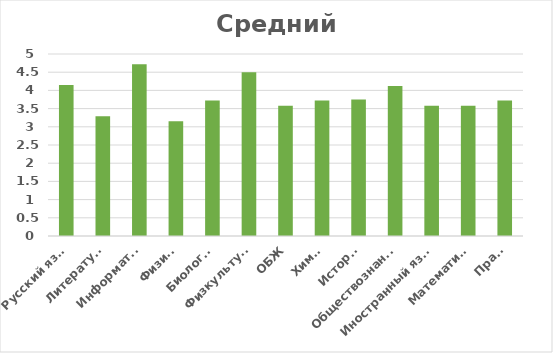
| Category | Средний балл |
|---|---|
| Русский язык  | 4.15 |
| Литература | 3.29 |
| Информатка | 4.72 |
| Физика | 3.15 |
| Биология | 3.72 |
| Физкультура | 4.5 |
| ОБЖ | 3.58 |
| Химия | 3.72 |
| История | 3.75 |
| Обществознание | 4.12 |
| Иностранный язык | 3.58 |
| Математика | 3.58 |
| Право | 3.72 |